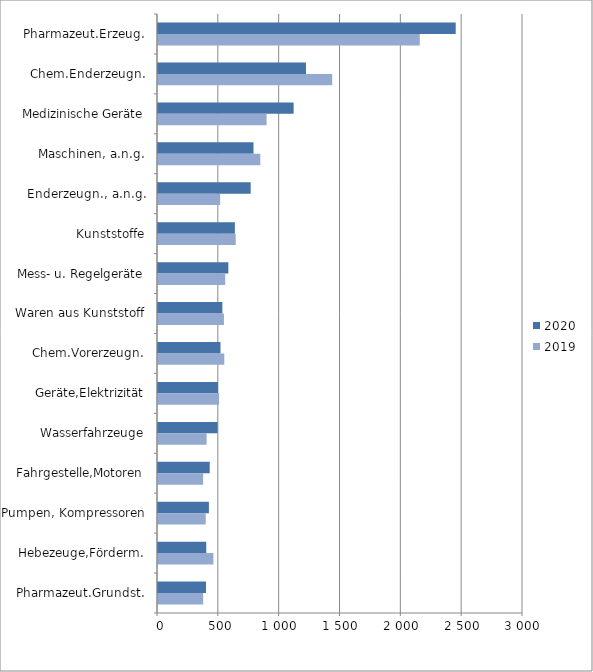
| Category | 2020 | 2019 |
|---|---|---|
| Pharmazeut.Erzeug. | 2447.031 | 2151.442 |
| Chem.Enderzeugn. | 1216.336 | 1431.948 |
| Medizinische Geräte | 1114.803 | 892.528 |
| Maschinen, a.n.g. | 784.786 | 840.821 |
| Enderzeugn., a.n.g. | 761.694 | 510.822 |
| Kunststoffe | 631.859 | 638.682 |
| Mess- u. Regelgeräte | 578.137 | 552.541 |
| Waren aus Kunststoff | 528.926 | 541.919 |
| Chem.Vorerzeugn. | 513.552 | 544.629 |
| Geräte,Elektrizität | 493.285 | 501.774 |
| Wasserfahrzeuge | 489.986 | 399.53 |
| Fahrgestelle,Motoren | 425.101 | 371.032 |
| Pumpen, Kompressoren | 418.468 | 392.35 |
| Hebezeuge,Förderm. | 396.503 | 455.346 |
| Pharmazeut.Grundst. | 394.705 | 371.396 |